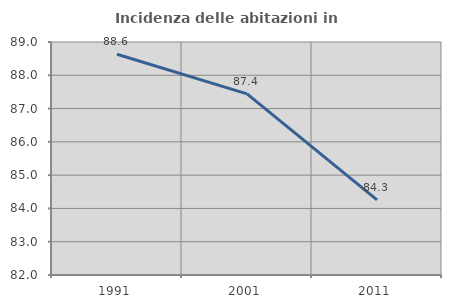
| Category | Incidenza delle abitazioni in proprietà  |
|---|---|
| 1991.0 | 88.631 |
| 2001.0 | 87.443 |
| 2011.0 | 84.256 |